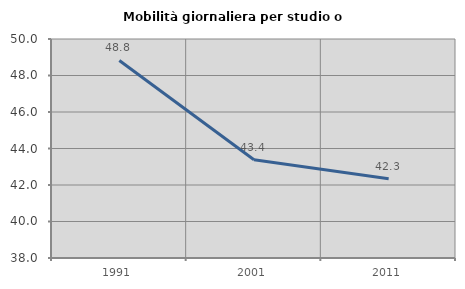
| Category | Mobilità giornaliera per studio o lavoro |
|---|---|
| 1991.0 | 48.824 |
| 2001.0 | 43.382 |
| 2011.0 | 42.342 |